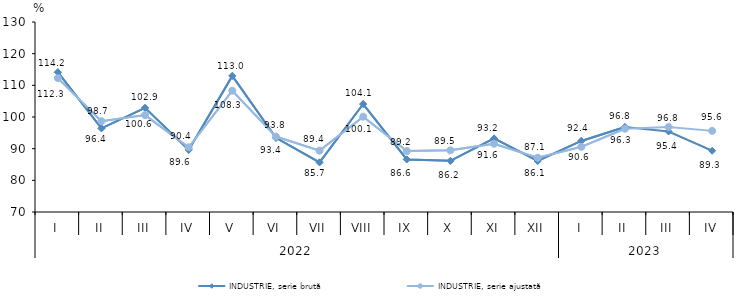
| Category | INDUSTRIE, serie brută | INDUSTRIE, serie ajustată |
|---|---|---|
| 0 | 114.151 | 112.283 |
| 1 | 96.419 | 98.68 |
| 2 | 102.886 | 100.594 |
| 3 | 89.614 | 90.447 |
| 4 | 112.973 | 108.294 |
| 5 | 93.417 | 93.82 |
| 6 | 85.678 | 89.372 |
| 7 | 104.099 | 100.102 |
| 8 | 86.603 | 89.228 |
| 9 | 86.164 | 89.466 |
| 10 | 93.241 | 91.558 |
| 11 | 86.103 | 87.134 |
| 12 | 92.442 | 90.58 |
| 13 | 96.83 | 96.297 |
| 14 | 95.412 | 96.841 |
| 15 | 89.344 | 95.618 |